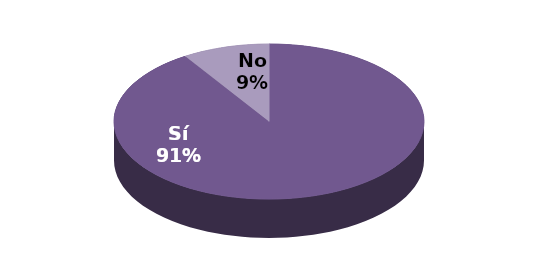
| Category | Series 1 |
|---|---|
| Sí | 20 |
| No | 2 |